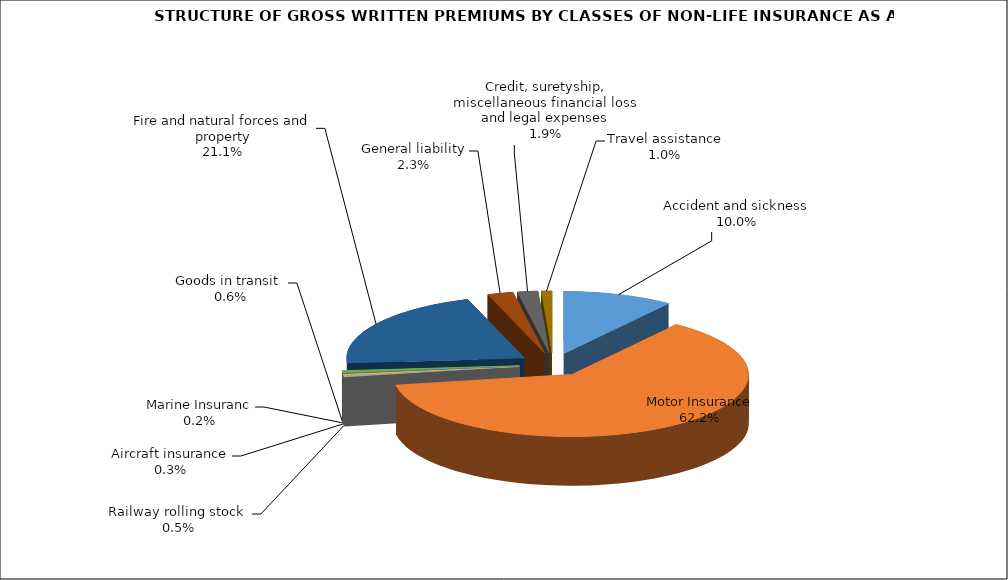
| Category | Accident and sickness | Series 1 |
|---|---|---|
| Accident and sickness | 0.1 |  |
| Motor Insurance | 0.622 |  |
| Railway rolling stock  | 0.005 |  |
| Aircraft insurance | 0.003 |  |
| Marine Insuranc | 0.002 |  |
| Goods in transit  | 0.006 |  |
| Fire and natural forces and property | 0.211 |  |
| General liability | 0.023 |  |
| Credit, suretyship, miscellaneous financial loss and legal expenses | 0.019 |  |
| Travel assistance | 0.01 |  |